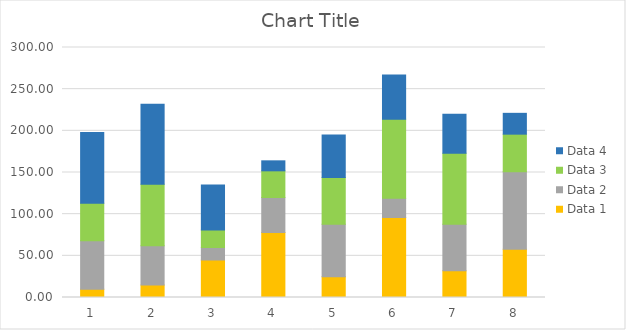
| Category | Data 3 | Data 2 | Data 1 | Data 4 |
|---|---|---|---|---|
| 0 | 45 | 58 | 10 | 85 |
| 1 | 74 | 47 | 15 | 96 |
| 2 | 21 | 15 | 45 | 54 |
| 3 | 32 | 42 | 78 | 12 |
| 4 | 56 | 63 | 25 | 51 |
| 5 | 95 | 23 | 96 | 53 |
| 6 | 85 | 56 | 32 | 47 |
| 7 | 45 | 93 | 58 | 25 |